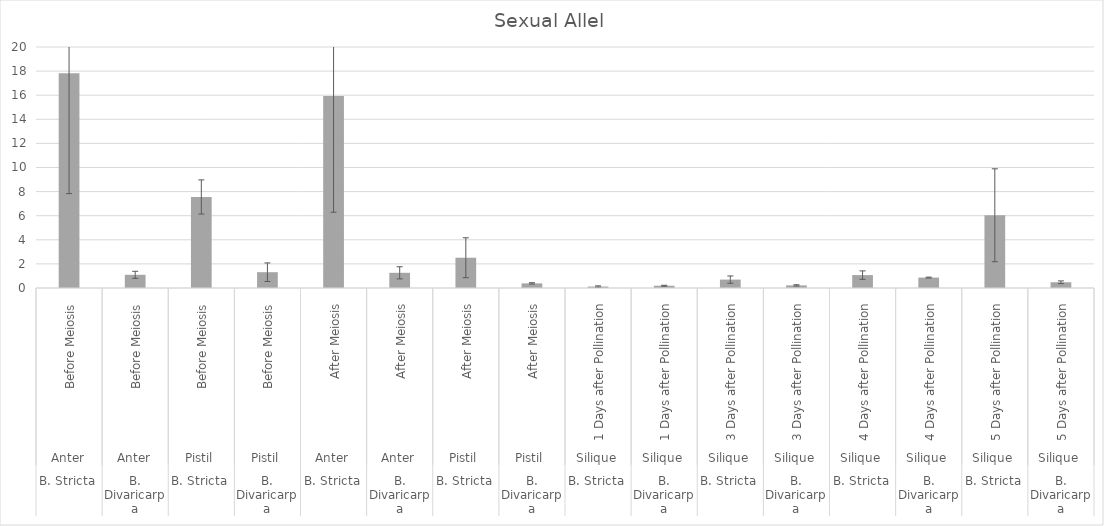
| Category | Series 0 |
|---|---|
| 0 | 17.83 |
| 1 | 1.095 |
| 2 | 7.554 |
| 3 | 1.312 |
| 4 | 15.931 |
| 5 | 1.26 |
| 6 | 2.512 |
| 7 | 0.384 |
| 8 | 0.12 |
| 9 | 0.188 |
| 10 | 0.697 |
| 11 | 0.218 |
| 12 | 1.071 |
| 13 | 0.865 |
| 14 | 6.036 |
| 15 | 0.477 |